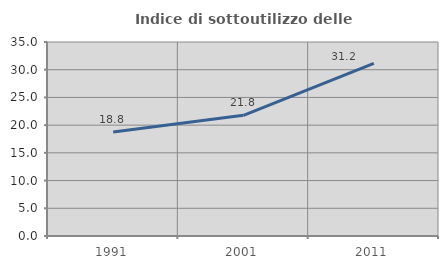
| Category | Indice di sottoutilizzo delle abitazioni  |
|---|---|
| 1991.0 | 18.77 |
| 2001.0 | 21.771 |
| 2011.0 | 31.162 |